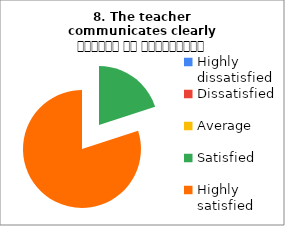
| Category | 8. The teacher communicates clearly शिक्षक का सम्प्रेषण सुस्पष्ट है |
|---|---|
| Highly dissatisfied | 0 |
| Dissatisfied | 0 |
| Average | 0 |
| Satisfied | 1 |
| Highly satisfied | 4 |